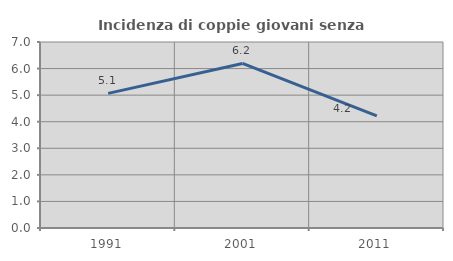
| Category | Incidenza di coppie giovani senza figli |
|---|---|
| 1991.0 | 5.066 |
| 2001.0 | 6.193 |
| 2011.0 | 4.223 |